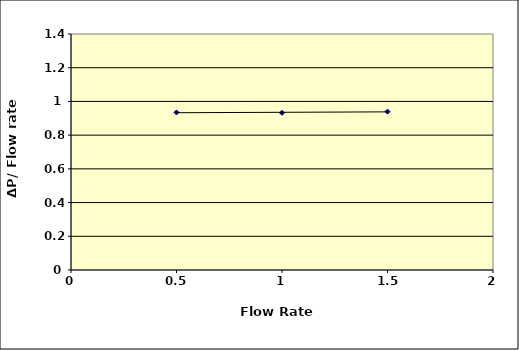
| Category | Series 0 |
|---|---|
| nan | 0 |
| 0.5 | 0.935 |
| 1.0 | 0.932 |
| 1.5 | 0.94 |